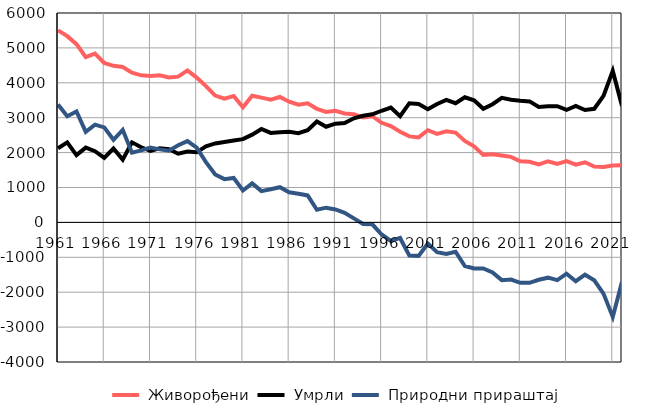
| Category |  Живорођени |  Умрли |  Природни прираштај |
|---|---|---|---|
| 1961.0 | 5502 | 2125 | 3377 |
| 1962.0 | 5336 | 2292 | 3044 |
| 1963.0 | 5108 | 1929 | 3179 |
| 1964.0 | 4736 | 2143 | 2593 |
| 1965.0 | 4839 | 2039 | 2800 |
| 1966.0 | 4571 | 1848 | 2723 |
| 1967.0 | 4486 | 2118 | 2368 |
| 1968.0 | 4452 | 1799 | 2653 |
| 1969.0 | 4292 | 2294 | 1998 |
| 1970.0 | 4214 | 2152 | 2062 |
| 1971.0 | 4192 | 2050 | 2142 |
| 1972.0 | 4217 | 2125 | 2092 |
| 1973.0 | 4154 | 2097 | 2057 |
| 1974.0 | 4177 | 1967 | 2210 |
| 1975.0 | 4356 | 2028 | 2328 |
| 1976.0 | 4150 | 2008 | 2142 |
| 1977.0 | 3906 | 2178 | 1728 |
| 1978.0 | 3634 | 2262 | 1372 |
| 1979.0 | 3545 | 2305 | 1240 |
| 1980.0 | 3621 | 2346 | 1275 |
| 1981.0 | 3298 | 2385 | 913 |
| 1982.0 | 3631 | 2514 | 1117 |
| 1983.0 | 3574 | 2678 | 896 |
| 1984.0 | 3516 | 2565 | 951 |
| 1985.0 | 3594 | 2586 | 1008 |
| 1986.0 | 3458 | 2596 | 862 |
| 1987.0 | 3373 | 2554 | 819 |
| 1988.0 | 3413 | 2640 | 773 |
| 1989.0 | 3254 | 2893 | 361 |
| 1990.0 | 3164 | 2742 | 422 |
| 1991.0 | 3199 | 2828 | 371 |
| 1992.0 | 3123 | 2848 | 275 |
| 1993.0 | 3097 | 2982 | 115 |
| 1994.0 | 3006 | 3054 | -48 |
| 1995.0 | 3042 | 3096 | -54 |
| 1996.0 | 2853 | 3199 | -346 |
| 1997.0 | 2758 | 3289 | -531 |
| 1998.0 | 2596 | 3042 | -446 |
| 1999.0 | 2464 | 3415 | -951 |
| 2000.0 | 2435 | 3394 | -959 |
| 2001.0 | 2641 | 3245 | -604 |
| 2002.0 | 2538 | 3392 | -854 |
| 2003.0 | 2609 | 3510 | -901 |
| 2004.0 | 2574 | 3414 | -840 |
| 2005.0 | 2334 | 3585 | -1251 |
| 2006.0 | 2180 | 3498 | -1318 |
| 2007.0 | 1935 | 3256 | -1321 |
| 2008.0 | 1953 | 3387 | -1434 |
| 2009.0 | 1914 | 3568 | -1654 |
| 2010.0 | 1878 | 3516 | -1638 |
| 2011.0 | 1751 | 3483 | -1732 |
| 2012.0 | 1735 | 3467 | -1732 |
| 2013.0 | 1664 | 3307 | -1643 |
| 2014.0 | 1747 | 3331 | -1584 |
| 2015.0 | 1676 | 3329 | -1653 |
| 2016.0 | 1754 | 3222 | -1468 |
| 2017.0 | 1655 | 3340 | -1685 |
| 2018.0 | 1722 | 3220 | -1498 |
| 2019.0 | 1598 | 3256 | -1658 |
| 2020.0 | 1586 | 3626 | -2040 |
| 2021.0 | 1632 | 4341 | -2709 |
| 2022.0 | 1637 | 3336 | -1699 |